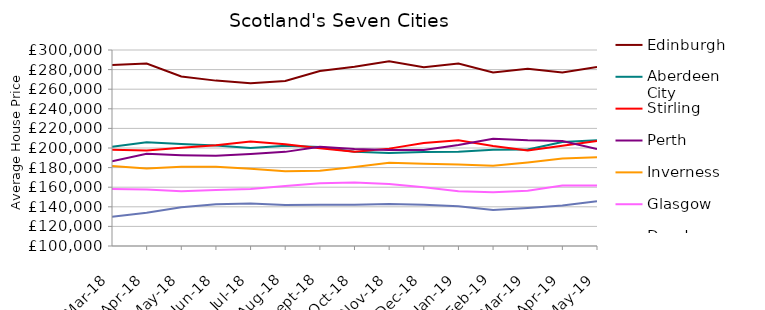
| Category | Edinburgh | Aberdeen City | Stirling | Perth | Inverness | Glasgow | Dundee |
|---|---|---|---|---|---|---|---|
| 2018-03-01 | 284786.633 | 201264.615 | 198088.766 | 186330.291 | 181586.441 | 158180.598 | 129844.063 |
| 2018-04-01 | 286205.735 | 205810.88 | 197416.149 | 194081.829 | 179023.043 | 157716.149 | 133880.221 |
| 2018-05-01 | 272931.201 | 203958.611 | 200313.463 | 192725.845 | 180897.659 | 155877.228 | 139583.84 |
| 2018-06-01 | 268756.999 | 202661.025 | 202708.336 | 192116.113 | 180958.147 | 157198.136 | 142686.273 |
| 2018-07-01 | 266138.827 | 199965.32 | 206601.819 | 193990.699 | 178829.45 | 158097.141 | 143294.915 |
| 2018-08-01 | 268282.317 | 202358.224 | 203914.892 | 196051.865 | 176372.452 | 161139.046 | 141858.815 |
| 2018-09-01 | 278602.137 | 201027.808 | 199729.339 | 201265.179 | 176775.685 | 164046.019 | 142001.763 |
| 2018-10-01 | 282996.121 | 196170.652 | 196136.918 | 199041.112 | 180507.097 | 164732.815 | 142188.758 |
| 2018-11-01 | 288390.443 | 194907.255 | 199361.08 | 198065.916 | 184910.444 | 163318.674 | 142764.741 |
| 2018-12-01 | 282317.611 | 195949.728 | 204989.465 | 197897.115 | 183965.585 | 159865.935 | 142213.711 |
| 2019-01-01 | 286281.169 | 196226.814 | 207969.828 | 203154.328 | 183067.554 | 155759.274 | 140497.829 |
| 2019-02-01 | 277082.376 | 198245.313 | 202149.265 | 209495.946 | 181852.413 | 154879.828 | 136785.996 |
| 2019-03-01 | 280735.036 | 198369.496 | 197464.96 | 207817.04 | 185293.083 | 156477.387 | 138787.958 |
| 2019-04-01 | 276984.752 | 206117.934 | 202275.522 | 207174.283 | 189165.457 | 161688.47 | 141313.538 |
| 2019-05-01 | 282660.508 | 207885.859 | 207137.35 | 198896.533 | 190440.979 | 161620.772 | 145624.457 |